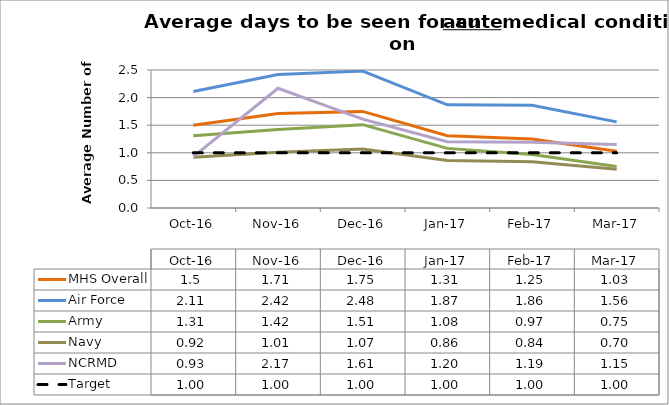
| Category | MHS Overall | Air Force | Army | Navy | NCRMD | Target |
|---|---|---|---|---|---|---|
| 2016-10-01 | 1.5 | 2.11 | 1.31 | 0.92 | 0.93 | 1 |
| 2016-11-01 | 1.71 | 2.42 | 1.42 | 1.01 | 2.17 | 1 |
| 2016-12-01 | 1.75 | 2.48 | 1.51 | 1.07 | 1.61 | 1 |
| 2017-01-01 | 1.31 | 1.87 | 1.08 | 0.86 | 1.2 | 1 |
| 2017-02-01 | 1.25 | 1.86 | 0.97 | 0.84 | 1.19 | 1 |
| 2017-03-01 | 1.03 | 1.56 | 0.75 | 0.7 | 1.15 | 1 |